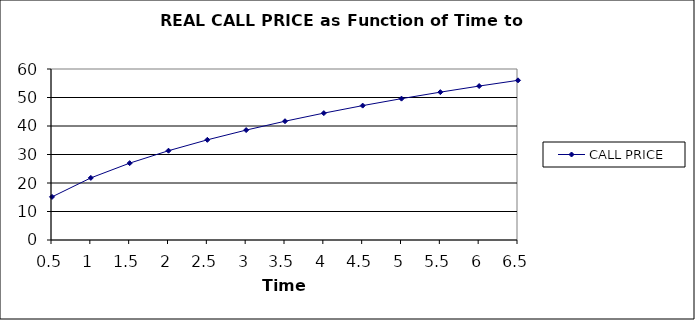
| Category | CALL PRICE |
|---|---|
| 0.5 | 15.127 |
| 1.0 | 21.793 |
| 1.5 | 26.966 |
| 2.0 | 31.328 |
| 2.5 | 35.148 |
| 3.0 | 38.568 |
| 3.5 | 41.673 |
| 4.0 | 44.521 |
| 4.5 | 47.152 |
| 5.0 | 49.596 |
| 5.5 | 51.878 |
| 6.0 | 54.015 |
| 6.5 | 56.023 |